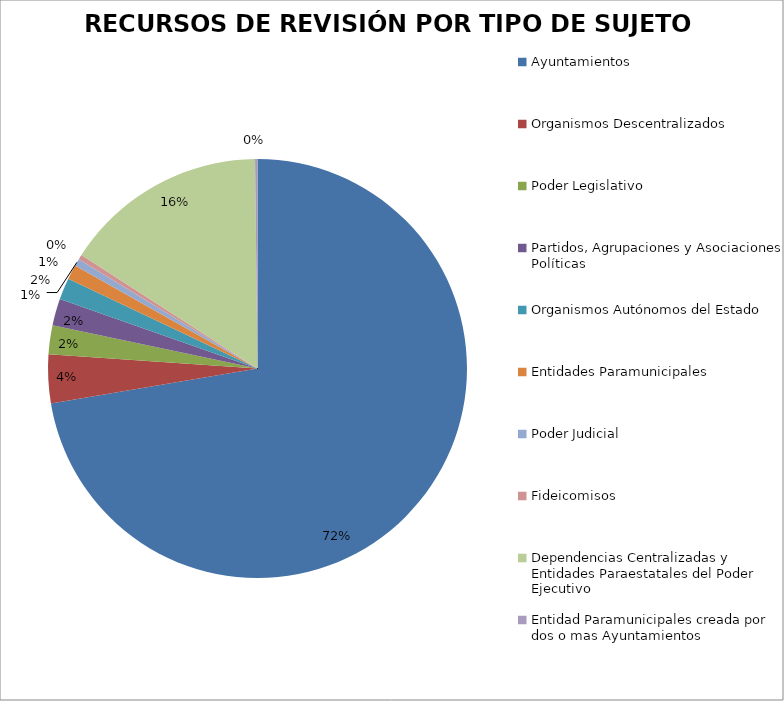
| Category | Series 0 |
|---|---|
| Ayuntamientos | 387 |
| Organismos Descentralizados | 20 |
| Poder Legislativo | 12 |
| Partidos, Agrupaciones y Asociaciones Políticas | 11 |
| Organismos Autónomos del Estado | 9 |
| Entidades Paramunicipales | 6 |
| Poder Judicial | 3 |
| Fideicomisos | 2 |
| Dependencias Centralizadas y Entidades Paraestatales del Poder Ejecutivo | 84 |
| Entidad Paramunicipales creada por dos o mas Ayuntamientos | 1 |